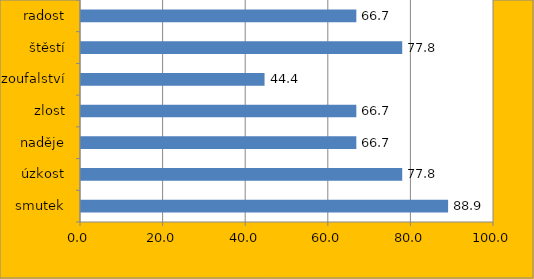
| Category | Series 0 |
|---|---|
| smutek | 88.889 |
| úzkost | 77.778 |
| naděje | 66.667 |
| zlost | 66.667 |
| zoufalství | 44.444 |
| štěstí | 77.778 |
| radost | 66.667 |